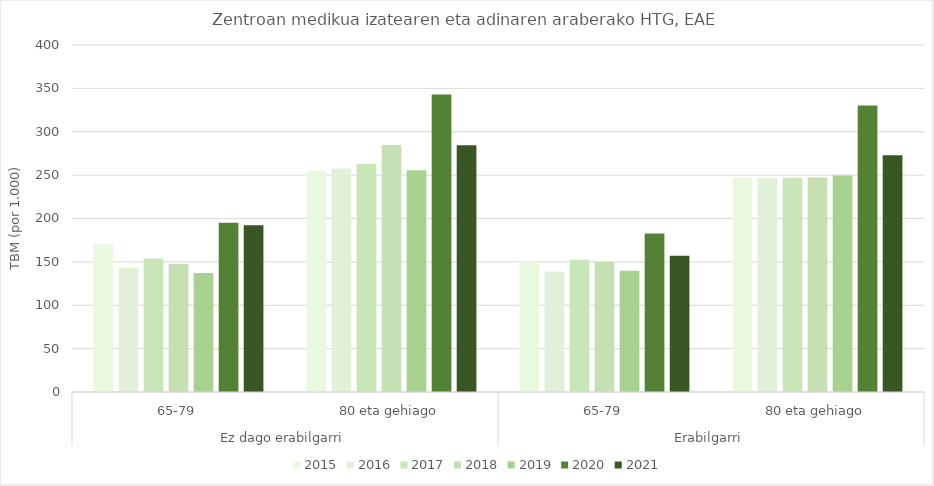
| Category | 2015 | 2016 | 2017 | 2018 | 2019 | 2020 | 2021 |
|---|---|---|---|---|---|---|---|
| 0 | 170.177 | 143.21 | 153.846 | 147.493 | 137.255 | 195.158 | 192.192 |
| 1 | 254.782 | 257.56 | 263.04 | 284.628 | 255.521 | 342.838 | 284.54 |
| 2 | 149.569 | 138.874 | 152.542 | 150.169 | 139.676 | 182.754 | 157.109 |
| 3 | 247.097 | 246.735 | 247.065 | 247.351 | 249.436 | 330.275 | 272.884 |